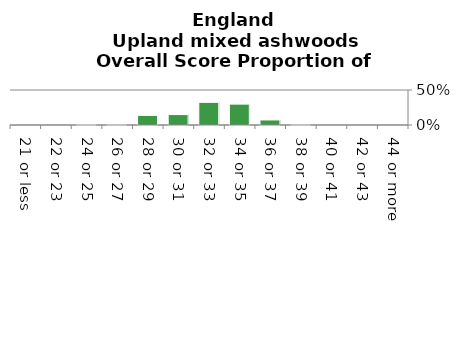
| Category | Upland mixed ashwoods |
|---|---|
| 21 or less | 0 |
| 22 or 23 | 0 |
| 24 or 25 | 0.007 |
| 26 or 27 | 0.006 |
| 28 or 29 | 0.138 |
| 30 or 31 | 0.149 |
| 32 or 33 | 0.324 |
| 34 or 35 | 0.298 |
| 36 or 37 | 0.072 |
| 38 or 39 | 0.006 |
| 40 or 41 | 0 |
| 42 or 43 | 0 |
| 44 or more | 0 |